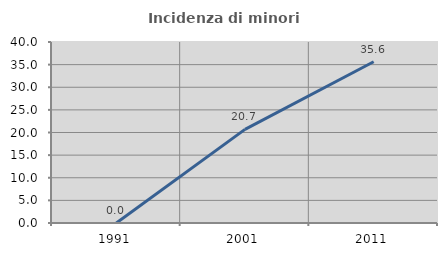
| Category | Incidenza di minori stranieri |
|---|---|
| 1991.0 | 0 |
| 2001.0 | 20.69 |
| 2011.0 | 35.632 |